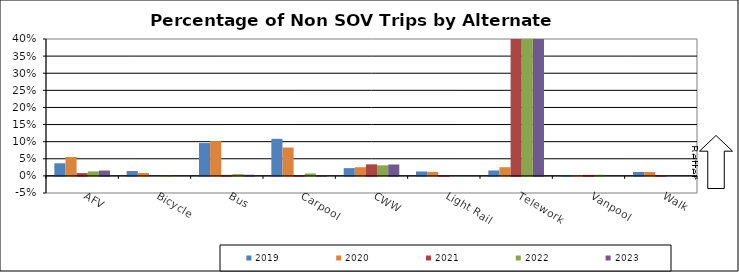
| Category | 2019 | 2020 | 2021 | 2022 | 2023 |
|---|---|---|---|---|---|
| AFV | 0.037 | 0.055 | 0.008 | 0.013 | 0.016 |
| Bicycle | 0.014 | 0.008 | 0 | 0.001 | 0 |
| Bus | 0.096 | 0.102 | 0.003 | 0.005 | 0.003 |
| Carpool | 0.108 | 0.083 | 0.001 | 0.007 | 0.002 |
| CWW | 0.023 | 0.025 | 0.034 | 0.031 | 0.033 |
| Light Rail | 0.013 | 0.012 | 0.002 | 0 | 0 |
| Telework | 0.016 | 0.025 | 0.801 | 0.793 | 0.818 |
| Vanpool | 0.002 | 0.002 | 0.003 | 0.003 | 0 |
| Walk | 0.011 | 0.011 | 0.002 | 0 | 0 |